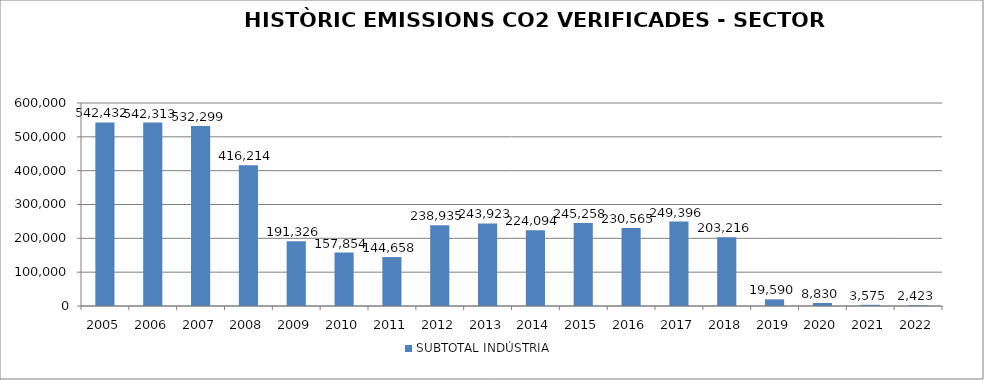
| Category | SUBTOTAL INDÚSTRIA |
|---|---|
| 2005.0 | 542432 |
| 2006.0 | 542313 |
| 2007.0 | 532299 |
| 2008.0 | 416214 |
| 2009.0 | 191326 |
| 2010.0 | 157854 |
| 2011.0 | 144658 |
| 2012.0 | 238935 |
| 2013.0 | 243923 |
| 2014.0 | 224094 |
| 2015.0 | 245258 |
| 2016.0 | 230565 |
| 2017.0 | 249396 |
| 2018.0 | 203216 |
| 2019.0 | 19590 |
| 2020.0 | 8830 |
| 2021.0 | 3575 |
| 2022.0 | 2423 |